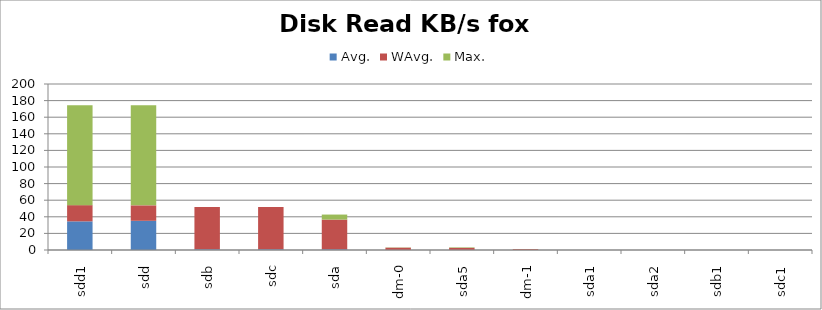
| Category | Avg. | WAvg. | Max. |
|---|---|---|---|
| sdd1 | 34.525 | 19.534 | 120.241 |
| sdd | 35.185 | 18.603 | 120.512 |
| sdb | 0.863 | 50.937 | 0 |
| sdc | 0.863 | 50.937 | 0 |
| sda | 0.838 | 35.806 | 6.056 |
| dm-0 | 0.107 | 2.718 | 0.275 |
| sda5 | 0.127 | 2.494 | 0.579 |
| dm-1 | 0.02 | 0.997 | 0.083 |
| sda1 | 0 | 0 | 0 |
| sda2 | 0 | 0 | 0 |
| sdb1 | 0 | 0 | 0 |
| sdc1 | 0 | 0 | 0 |